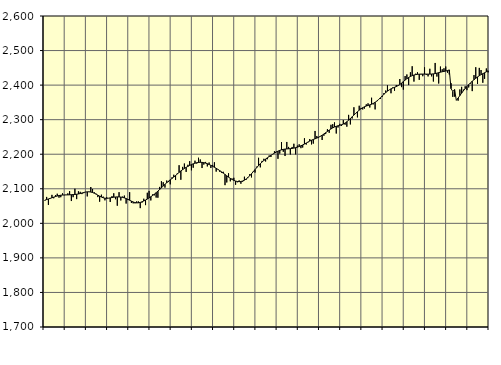
| Category | Piggar | Series 1 |
|---|---|---|
| nan | 2065.5 | 2067.15 |
| 1.0 | 2076.4 | 2068.86 |
| 1.0 | 2053.3 | 2070.5 |
| 1.0 | 2073.1 | 2072.2 |
| 1.0 | 2082.4 | 2073.96 |
| 1.0 | 2072.5 | 2075.69 |
| 1.0 | 2081.6 | 2077.54 |
| 1.0 | 2085.7 | 2079.04 |
| 1.0 | 2074.3 | 2080.4 |
| 1.0 | 2075.6 | 2081.34 |
| 1.0 | 2086.9 | 2081.89 |
| 1.0 | 2081.4 | 2082.15 |
| nan | 2082.7 | 2082.22 |
| 2.0 | 2086.7 | 2082.32 |
| 2.0 | 2093.1 | 2082.53 |
| 2.0 | 2064.5 | 2082.85 |
| 2.0 | 2075.7 | 2083.17 |
| 2.0 | 2100.1 | 2083.56 |
| 2.0 | 2070.1 | 2084.14 |
| 2.0 | 2092.8 | 2085 |
| 2.0 | 2091.2 | 2086.24 |
| 2.0 | 2084.6 | 2087.76 |
| 2.0 | 2087.3 | 2089.25 |
| 2.0 | 2090.8 | 2090.48 |
| nan | 2077.9 | 2091.2 |
| 3.0 | 2090.7 | 2091.23 |
| 3.0 | 2105.1 | 2090.53 |
| 3.0 | 2099.4 | 2089.14 |
| 3.0 | 2089.8 | 2087.1 |
| 3.0 | 2085.7 | 2084.52 |
| 3.0 | 2075.9 | 2081.61 |
| 3.0 | 2062.6 | 2078.7 |
| 3.0 | 2082.9 | 2076.05 |
| 3.0 | 2077.4 | 2073.99 |
| 3.0 | 2066.5 | 2072.72 |
| 3.0 | 2075.7 | 2072.34 |
| nan | 2073 | 2072.79 |
| 4.0 | 2061.8 | 2073.7 |
| 4.0 | 2078.7 | 2074.71 |
| 4.0 | 2087 | 2075.59 |
| 4.0 | 2069.7 | 2076.24 |
| 4.0 | 2051 | 2076.55 |
| 4.0 | 2090.1 | 2076.46 |
| 4.0 | 2066.2 | 2076.01 |
| 4.0 | 2077.3 | 2075.13 |
| 4.0 | 2080.3 | 2073.66 |
| 4.0 | 2057.2 | 2071.76 |
| 4.0 | 2067.3 | 2069.46 |
| nan | 2090.1 | 2066.82 |
| 5.0 | 2058.9 | 2064.19 |
| 5.0 | 2057.8 | 2061.87 |
| 5.0 | 2057.8 | 2060.1 |
| 5.0 | 2063.6 | 2059.19 |
| 5.0 | 2063.3 | 2059.38 |
| 5.0 | 2044 | 2060.51 |
| 5.0 | 2060.1 | 2062.31 |
| 5.0 | 2071.2 | 2064.61 |
| 5.0 | 2052.7 | 2067.28 |
| 5.0 | 2088.5 | 2070.24 |
| 5.0 | 2093.8 | 2073.48 |
| nan | 2066.3 | 2076.93 |
| 6.0 | 2083.7 | 2080.58 |
| 6.0 | 2081 | 2084.49 |
| 6.0 | 2074.5 | 2088.72 |
| 6.0 | 2074.1 | 2093.23 |
| 6.0 | 2105.4 | 2097.89 |
| 6.0 | 2121.9 | 2102.8 |
| 6.0 | 2119 | 2107.85 |
| 6.0 | 2103.4 | 2112.76 |
| 6.0 | 2123.8 | 2117.47 |
| 6.0 | 2119.5 | 2121.91 |
| 6.0 | 2112.8 | 2125.96 |
| nan | 2133.2 | 2129.88 |
| 7.0 | 2140.6 | 2134 |
| 7.0 | 2125.3 | 2138.3 |
| 7.0 | 2144.9 | 2142.81 |
| 7.0 | 2168.2 | 2147.34 |
| 7.0 | 2126.1 | 2151.6 |
| 7.0 | 2163.3 | 2155.42 |
| 7.0 | 2173.1 | 2158.83 |
| 7.0 | 2148.8 | 2161.93 |
| 7.0 | 2169.4 | 2164.85 |
| 7.0 | 2179.8 | 2167.52 |
| 7.0 | 2153.4 | 2170.02 |
| nan | 2160.9 | 2172.27 |
| 8.0 | 2181.3 | 2174.05 |
| 8.0 | 2173 | 2175.38 |
| 8.0 | 2189.8 | 2176.26 |
| 8.0 | 2184.8 | 2176.59 |
| 8.0 | 2160 | 2176.37 |
| 8.0 | 2170 | 2175.64 |
| 8.0 | 2177.7 | 2174.32 |
| 8.0 | 2164.7 | 2172.51 |
| 8.0 | 2176 | 2170.28 |
| 8.0 | 2160 | 2167.74 |
| 8.0 | 2169.1 | 2165.01 |
| nan | 2176.7 | 2162.18 |
| 9.0 | 2149.7 | 2159.23 |
| 9.0 | 2155.5 | 2156.06 |
| 9.0 | 2149.2 | 2152.64 |
| 9.0 | 2146.4 | 2148.99 |
| 9.0 | 2149.2 | 2145.22 |
| 9.0 | 2110.5 | 2141.38 |
| 9.0 | 2118.3 | 2137.52 |
| 9.0 | 2144.9 | 2133.76 |
| 9.0 | 2121.6 | 2130.21 |
| 9.0 | 2129.6 | 2127.02 |
| 9.0 | 2131.8 | 2124.36 |
| nan | 2111.7 | 2122.33 |
| 10.0 | 2118.8 | 2121.07 |
| 10.0 | 2124.2 | 2120.63 |
| 10.0 | 2114.6 | 2121.1 |
| 10.0 | 2120.6 | 2122.55 |
| 10.0 | 2134.9 | 2124.98 |
| 10.0 | 2126.3 | 2128.39 |
| 10.0 | 2130.9 | 2132.75 |
| 10.0 | 2142.3 | 2137.84 |
| 10.0 | 2132.9 | 2143.46 |
| 10.0 | 2150.5 | 2149.45 |
| 10.0 | 2146.9 | 2155.51 |
| nan | 2164.1 | 2161.44 |
| 11.0 | 2189.7 | 2167.16 |
| 11.0 | 2162 | 2172.55 |
| 11.0 | 2180.7 | 2177.44 |
| 11.0 | 2186.8 | 2181.87 |
| 11.0 | 2179 | 2185.97 |
| 11.0 | 2185.5 | 2189.71 |
| 11.0 | 2196.3 | 2193.2 |
| 11.0 | 2192 | 2196.6 |
| 11.0 | 2199.4 | 2199.95 |
| 11.0 | 2208.7 | 2203.17 |
| 11.0 | 2207.4 | 2206.21 |
| nan | 2186.7 | 2208.92 |
| 12.0 | 2201.9 | 2211.11 |
| 12.0 | 2235.3 | 2212.76 |
| 12.0 | 2207.1 | 2214.02 |
| 12.0 | 2194.8 | 2214.83 |
| 12.0 | 2235.5 | 2215.33 |
| 12.0 | 2221.1 | 2215.73 |
| 12.0 | 2199.2 | 2216.13 |
| 12.0 | 2221 | 2216.73 |
| 12.0 | 2230.3 | 2217.71 |
| 12.0 | 2199.6 | 2218.98 |
| 12.0 | 2225.1 | 2220.48 |
| nan | 2228.7 | 2222.28 |
| 13.0 | 2217.5 | 2224.38 |
| 13.0 | 2219.4 | 2226.81 |
| 13.0 | 2246.2 | 2229.49 |
| 13.0 | 2227.9 | 2232.4 |
| 13.0 | 2234.4 | 2235.31 |
| 13.0 | 2243.9 | 2238 |
| 13.0 | 2228.4 | 2240.48 |
| 13.0 | 2230.7 | 2242.71 |
| 13.0 | 2267.3 | 2244.67 |
| 13.0 | 2252.8 | 2246.71 |
| 13.0 | 2247.7 | 2249.12 |
| nan | 2252.8 | 2251.89 |
| 14.0 | 2241.2 | 2255.07 |
| 14.0 | 2253.5 | 2258.58 |
| 14.0 | 2258.3 | 2262.26 |
| 14.0 | 2272.5 | 2266.01 |
| 14.0 | 2261.9 | 2269.67 |
| 14.0 | 2285.2 | 2273.12 |
| 14.0 | 2287 | 2276.24 |
| 14.0 | 2292.1 | 2278.83 |
| 14.0 | 2259.9 | 2280.78 |
| 14.0 | 2277.3 | 2282.26 |
| 14.0 | 2287.9 | 2283.62 |
| nan | 2281.9 | 2285.2 |
| 15.0 | 2298.8 | 2287.34 |
| 15.0 | 2285.4 | 2290.3 |
| 15.0 | 2279.7 | 2294.03 |
| 15.0 | 2313.9 | 2298.41 |
| 15.0 | 2286.2 | 2303.28 |
| 15.0 | 2303.3 | 2308.33 |
| 15.0 | 2335.9 | 2313.31 |
| 15.0 | 2318.9 | 2318.22 |
| 15.0 | 2306.6 | 2322.99 |
| 15.0 | 2340.3 | 2327.49 |
| 15.0 | 2333.9 | 2331.45 |
| nan | 2329.6 | 2334.75 |
| 16.0 | 2332.2 | 2337.4 |
| 16.0 | 2344.4 | 2339.48 |
| 16.0 | 2347.3 | 2341.19 |
| 16.0 | 2335.2 | 2342.81 |
| 16.0 | 2363.5 | 2344.68 |
| 16.0 | 2344.4 | 2347.13 |
| 16.0 | 2329.7 | 2350.25 |
| 16.0 | 2353.4 | 2354.03 |
| 16.0 | 2358.7 | 2358.47 |
| 16.0 | 2359.9 | 2363.32 |
| 16.0 | 2365.9 | 2368.31 |
| nan | 2377 | 2373.4 |
| 17.0 | 2384.3 | 2378.26 |
| 17.0 | 2399.5 | 2382.54 |
| 17.0 | 2386.1 | 2386.18 |
| 17.0 | 2376.4 | 2389.15 |
| 17.0 | 2393.2 | 2391.49 |
| 17.0 | 2383.7 | 2393.56 |
| 17.0 | 2400.4 | 2395.84 |
| 17.0 | 2399.8 | 2398.57 |
| 17.0 | 2417.6 | 2401.89 |
| 17.0 | 2394.2 | 2405.8 |
| 17.0 | 2387 | 2410.15 |
| nan | 2426.2 | 2414.5 |
| 18.0 | 2430.8 | 2418.55 |
| 18.0 | 2400.1 | 2422.09 |
| 18.0 | 2437.2 | 2424.97 |
| 18.0 | 2454.6 | 2427.29 |
| 18.0 | 2410.2 | 2429.18 |
| 18.0 | 2433.1 | 2430.46 |
| 18.0 | 2437.2 | 2431.23 |
| 18.0 | 2415.2 | 2431.7 |
| 18.0 | 2430.9 | 2431.92 |
| 18.0 | 2425.7 | 2431.96 |
| 18.0 | 2451.5 | 2431.96 |
| nan | 2429.7 | 2431.88 |
| 19.0 | 2425.2 | 2431.75 |
| 19.0 | 2447.3 | 2431.82 |
| 19.0 | 2425.3 | 2432.1 |
| 19.0 | 2410.4 | 2432.56 |
| 19.0 | 2464.1 | 2433.37 |
| 19.0 | 2424.7 | 2434.59 |
| 19.0 | 2404.6 | 2436.01 |
| 19.0 | 2453.7 | 2437.42 |
| 19.0 | 2445.8 | 2438.66 |
| 19.0 | 2448.7 | 2439.7 |
| 19.0 | 2453.8 | 2440.67 |
| nan | 2435.9 | 2441.93 |
| 20.0 | 2430.9 | 2443.96 |
| 20.0 | 2405.6 | 2389.76 |
| 20.0 | 2366 | 2381.55 |
| 20.0 | 2366.7 | 2387.06 |
| 20.0 | 2355.7 | 2355.76 |
| 20.0 | 2354.9 | 2362.58 |
| 20.0 | 2387.4 | 2369.74 |
| 20.0 | 2395 | 2376.81 |
| 20.0 | 2386.9 | 2383.55 |
| 20.0 | 2396.7 | 2389.96 |
| 20.0 | 2385.4 | 2395.92 |
| nan | 2393.2 | 2401.42 |
| 21.0 | 2404.4 | 2406.56 |
| 21.0 | 2382.6 | 2411.27 |
| 21.0 | 2429 | 2415.6 |
| 21.0 | 2451.8 | 2419.73 |
| 21.0 | 2403.3 | 2423.62 |
| 21.0 | 2449.8 | 2427.15 |
| 21.0 | 2443.7 | 2430.33 |
| 21.0 | 2406.8 | 2433.14 |
| 21.0 | 2418.2 | 2435.79 |
| 21.0 | 2448.2 | 2438.54 |
| 21.0 | 2436.9 | 2441.6 |